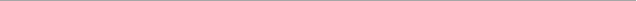
| Category | Section 1: DOCUMENTATION STANDARDS |
|---|---|
| 0 | 1 |